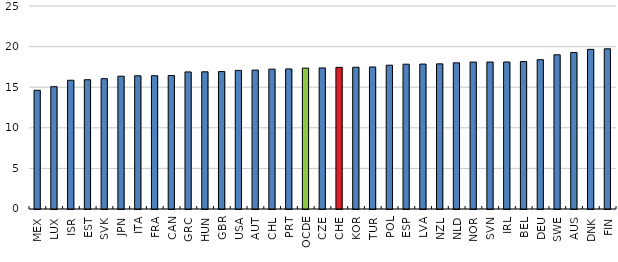
| Category | Series 0 |
|---|---|
| MEX | 14.622 |
| LUX | 15.065 |
| ISR | 15.855 |
| EST | 15.918 |
| SVK | 16.05 |
| JPN | 16.352 |
| ITA | 16.406 |
| FRA | 16.411 |
| CAN | 16.437 |
| GRC | 16.881 |
| HUN | 16.895 |
| GBR | 16.922 |
| USA | 17.069 |
| AUT | 17.112 |
| CHL | 17.222 |
| PRT | 17.25 |
| OCDE | 17.352 |
| CZE | 17.373 |
| CHE | 17.445 |
| KOR | 17.457 |
| TUR | 17.488 |
| POL | 17.71 |
| ESP | 17.833 |
| LVA | 17.849 |
| NZL | 17.874 |
| NLD | 17.998 |
| NOR | 18.092 |
| SVN | 18.099 |
| IRL | 18.105 |
| BEL | 18.153 |
| DEU | 18.386 |
| SWE | 18.991 |
| AUS | 19.277 |
| DNK | 19.659 |
| FIN | 19.727 |